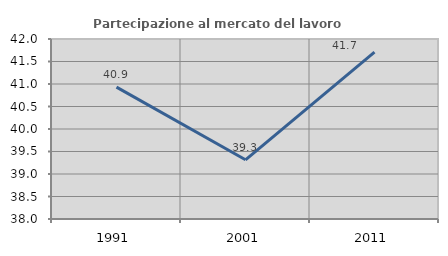
| Category | Partecipazione al mercato del lavoro  femminile |
|---|---|
| 1991.0 | 40.932 |
| 2001.0 | 39.315 |
| 2011.0 | 41.706 |